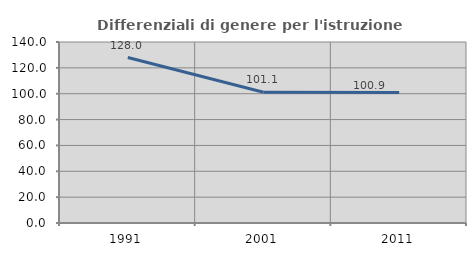
| Category | Differenziali di genere per l'istruzione superiore |
|---|---|
| 1991.0 | 127.971 |
| 2001.0 | 101.085 |
| 2011.0 | 100.883 |